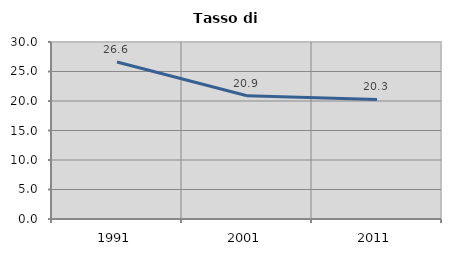
| Category | Tasso di disoccupazione   |
|---|---|
| 1991.0 | 26.622 |
| 2001.0 | 20.9 |
| 2011.0 | 20.261 |